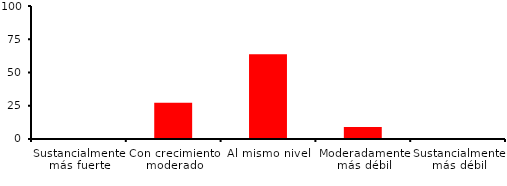
| Category | Series 0 |
|---|---|
| Sustancialmente más fuerte | 0 |
| Con crecimiento moderado | 27.273 |
| Al mismo nivel | 63.636 |
| Moderadamente más débil | 9.091 |
| Sustancialmente más débil | 0 |